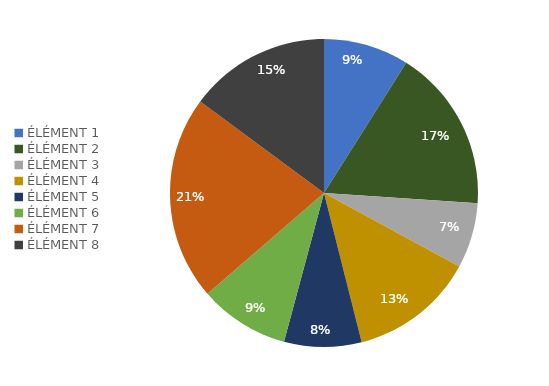
| Category | Series 0 | Series 1 |
|---|---|---|
| ÉLÉMENT 1 | 0.09 | 0.09 |
| ÉLÉMENT 2 | 0.171 | 0.171 |
| ÉLÉMENT 3 | 0.069 | 0.069 |
| ÉLÉMENT 4 | 0.131 | 0.131 |
| ÉLÉMENT 5 | 0.081 | 0.081 |
| ÉLÉMENT 6 | 0.095 | 0.095 |
| ÉLÉMENT 7 | 0.215 | 0.215 |
| ÉLÉMENT 8 | 0.149 | 0.149 |